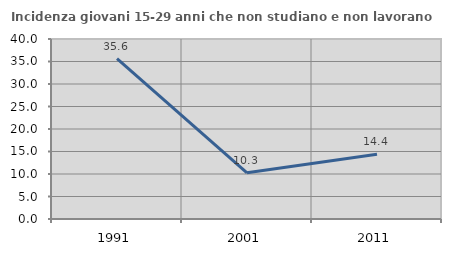
| Category | Incidenza giovani 15-29 anni che non studiano e non lavorano  |
|---|---|
| 1991.0 | 35.632 |
| 2001.0 | 10.26 |
| 2011.0 | 14.387 |